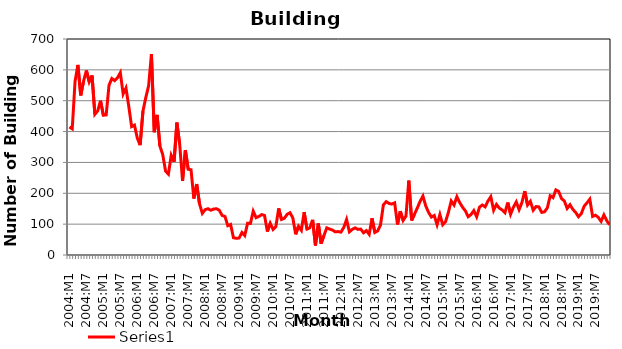
| Category | Series 0 |
|---|---|
| 2004:M1 | 415 |
| 2004:M2 | 409 |
| 2004:M3 | 563 |
| 2004:M4 | 616 |
| 2004:M5 | 517 |
| 2004:M6 | 563 |
| 2004:M7 | 598 |
| 2004:M8 | 561 |
| 2004:M9 | 582 |
| 2004:M10 | 456 |
| 2004:M11 | 467 |
| 2004:M12 | 500 |
| 2005:M1 | 453 |
| 2005:M2 | 454 |
| 2005:M3 | 550 |
| 2005:M4 | 572 |
| 2005:M5 | 565 |
| 2005:M6 | 574 |
| 2005:M7 | 591 |
| 2005:M8 | 522 |
| 2005:M9 | 541 |
| 2005:M10 | 481 |
| 2005:M11 | 416 |
| 2005:M12 | 421 |
| 2006:M1 | 379 |
| 2006:M2 | 356 |
| 2006:M3 | 466 |
| 2006:M4 | 510 |
| 2006:M5 | 548 |
| 2006:M6 | 651 |
| 2006:M7 | 398 |
| 2006:M8 | 454 |
| 2006:M9 | 353 |
| 2006:M10 | 325 |
| 2006:M11 | 272 |
| 2006:M12 | 262 |
| 2007:M1 | 323 |
| 2007:M2 | 302 |
| 2007:M3 | 429 |
| 2007:M4 | 358 |
| 2007:M5 | 240 |
| 2007:M6 | 340 |
| 2007:M7 | 278 |
| 2007:M8 | 276 |
| 2007:M9 | 183 |
| 2007:M10 | 230 |
| 2007:M11 | 166 |
| 2007:M12 | 135 |
| 2008:M1 | 147 |
| 2008:M2 | 150 |
| 2008:M3 | 145 |
| 2008:M4 | 149 |
| 2008:M5 | 150 |
| 2008:M6 | 145 |
| 2008:M7 | 128 |
| 2008:M8 | 125 |
| 2008:M9 | 95 |
| 2008:M10 | 99 |
| 2008:M11 | 56 |
| 2008:M12 | 54 |
| 2009:M1 | 55 |
| 2009:M2 | 73 |
| 2009:M3 | 63 |
| 2009:M4 | 103 |
| 2009:M5 | 102 |
| 2009:M6 | 142 |
| 2009:M7 | 121 |
| 2009:M8 | 125 |
| 2009:M9 | 131 |
| 2009:M10 | 128 |
| 2009:M11 | 76 |
| 2009:M12 | 103 |
| 2010:M1 | 83 |
| 2010:M2 | 92 |
| 2010:M3 | 151 |
| 2010:M4 | 115 |
| 2010:M5 | 119 |
| 2010:M6 | 132 |
| 2010:M7 | 137 |
| 2010:M8 | 120 |
| 2010:M9 | 67 |
| 2010:M10 | 93 |
| 2010:M11 | 80 |
| 2010:M12 | 139 |
| 2011:M1 | 84 |
| 2011:M2 | 88 |
| 2011:M3 | 114 |
| 2011:M4 | 31 |
| 2011:M5 | 102 |
| 2011:M6 | 37 |
| 2011:M7 | 63 |
| 2011:M8 | 88 |
| 2011:M9 | 84 |
| 2011:M10 | 81 |
| 2011:M11 | 75 |
| 2011:M12 | 76 |
| 2012:M1 | 74 |
| 2012:M2 | 89 |
| 2012:M3 | 115 |
| 2012:M4 | 75 |
| 2012:M5 | 83 |
| 2012:M6 | 88 |
| 2012:M7 | 83 |
| 2012:M8 | 84 |
| 2012:M9 | 72 |
| 2012:M10 | 79 |
| 2012:M11 | 67 |
| 2012:M12 | 119 |
| 2013:M1 | 73 |
| 2013:M2 | 78 |
| 2013:M3 | 97 |
| 2013:M4 | 162 |
| 2013:M5 | 173 |
| 2013:M6 | 167 |
| 2013:M7 | 165 |
| 2013:M8 | 169 |
| 2013:M9 | 99 |
| 2013:M10 | 142 |
| 2013:M11 | 112 |
| 2013:M12 | 126 |
| 2014:M1 | 241 |
| 2014:M2 | 112 |
| 2014:M3 | 132 |
| 2014:M4 | 152 |
| 2014:M5 | 174 |
| 2014:M6 | 191 |
| 2014:M7 | 159 |
| 2014:M8 | 138 |
| 2014:M9 | 123 |
| 2014:M10 | 128 |
| 2014:M11 | 98 |
| 2014:M12 | 131 |
| 2015:M1 | 98 |
| 2015:M2 | 108 |
| 2015:M3 | 138 |
| 2015:M4 | 175 |
| 2015:M5 | 162 |
| 2015:M6 | 189 |
| 2015:M7 | 170 |
| 2015:M8 | 155 |
| 2015:M9 | 143 |
| 2015:M10 | 124 |
| 2015:M11 | 131 |
| 2015:M12 | 144 |
| 2016:M1 | 124 |
| 2016:M2 | 155 |
| 2016:M3 | 162 |
| 2016:M4 | 156 |
| 2016:M5 | 175 |
| 2016:M6 | 189 |
| 2016:M7 | 145 |
| 2016:M8 | 164 |
| 2016:M9 | 152 |
| 2016:M10 | 146 |
| 2016:M11 | 137 |
| 2016:M12 | 170 |
| 2017:M1 | 132 |
| 2017:M2 | 155 |
| 2017:M3 | 172 |
| 2017:M4 | 147 |
| 2017:M5 | 170 |
| 2017:M6 | 207 |
| 2017:M7 | 162 |
| 2017:M8 | 174 |
| 2017:M9 | 145 |
| 2017:M10 | 157 |
| 2017:M11 | 156 |
| 2017:M12 | 138 |
| 2018:M1 | 140 |
| 2018:M2 | 153 |
| 2018:M3 | 192 |
| 2018:M4 | 186 |
| 2018:M5 | 211 |
| 2018:M6 | 206 |
| 2018:M7 | 183 |
| 2018:M8 | 175 |
| 2018:M9 | 151 |
| 2018:M10 | 163 |
| 2018:M11 | 148 |
| 2018:M12 | 138 |
| 2019:M1 | 124 |
| 2019:M2 | 134 |
| 2019:M3 | 158 |
| 2019:M4 | 169 |
| 2019:M5 | 181 |
| 2019:M6 | 125 |
| 2019:M7 | 129 |
| 2019:M8 | 122 |
| 2019:M9 | 109 |
| 2019:M10 | 130 |
| 2019:M11 | 111 |
| 2019:M12 | 98 |